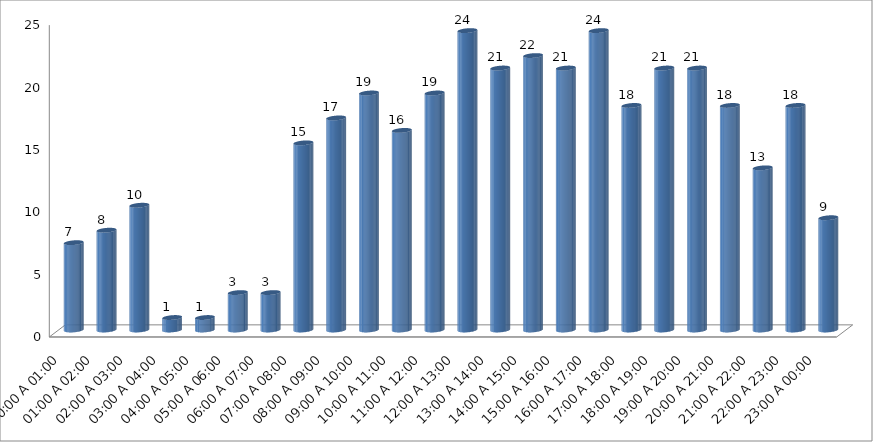
| Category | COMPUTO |
|---|---|
| 00:00 A 01:00 | 7 |
| 01:00 A 02:00 | 8 |
| 02:00 A 03:00 | 10 |
| 03:00 A 04:00 | 1 |
| 04:00 A 05:00 | 1 |
| 05:00 A 06:00 | 3 |
| 06:00 A 07:00 | 3 |
| 07:00 A 08:00 | 15 |
| 08:00 A 09:00 | 17 |
| 09:00 A 10:00 | 19 |
| 10:00 A 11:00 | 16 |
| 11:00 A 12:00 | 19 |
| 12:00 A 13:00 | 24 |
| 13:00 A 14:00 | 21 |
| 14:00 A 15:00 | 22 |
| 15:00 A 16:00 | 21 |
| 16:00 A 17:00 | 24 |
| 17:00 A 18:00 | 18 |
| 18:00 A 19:00 | 21 |
| 19:00 A 20:00 | 21 |
| 20:00 A 21:00 | 18 |
| 21:00 A 22:00 | 13 |
| 22:00 A 23:00 | 18 |
| 23:00 A 00:00 | 9 |